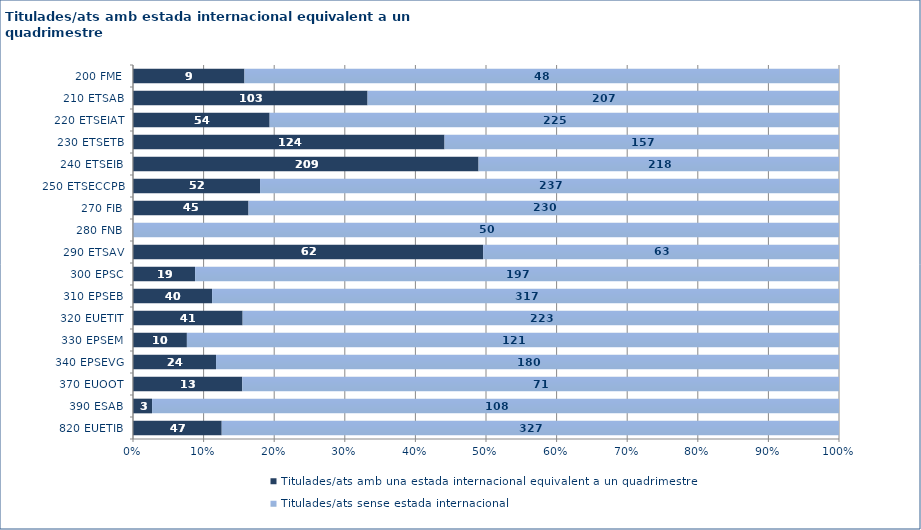
| Category | Titulades/ats amb una estada internacional equivalent a un quadrimestre | Titulades/ats sense estada internacional |
|---|---|---|
| 820 EUETIB | 47 | 327 |
| 390 ESAB | 3 | 108 |
| 370 EUOOT | 13 | 71 |
| 340 EPSEVG | 24 | 180 |
| 330 EPSEM | 10 | 121 |
| 320 EUETIT | 41 | 223 |
| 310 EPSEB | 40 | 317 |
| 300 EPSC | 19 | 197 |
| 290 ETSAV | 62 | 63 |
| 280 FNB | 0 | 50 |
| 270 FIB | 45 | 230 |
| 250 ETSECCPB | 52 | 237 |
| 240 ETSEIB | 209 | 218 |
| 230 ETSETB | 124 | 157 |
| 220 ETSEIAT | 54 | 225 |
| 210 ETSAB | 103 | 207 |
| 200 FME | 9 | 48 |